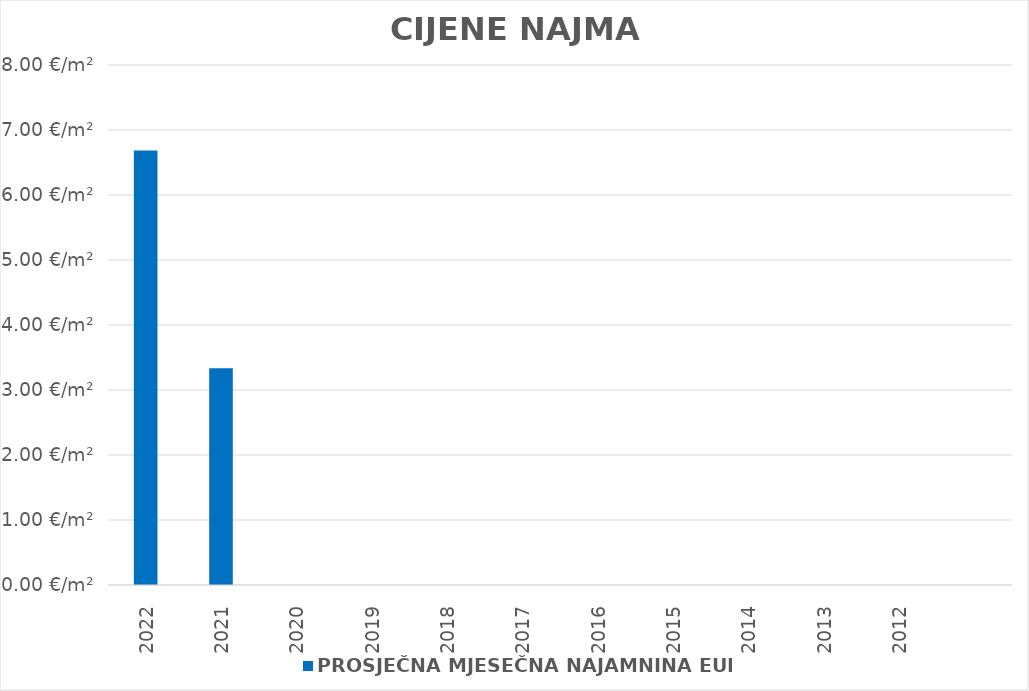
| Category | PROSJEČNA MJESEČNA NAJAMNINA EUR/m² |
|---|---|
| 2022 | 1900-01-06 16:27:31 |
| 2021 | 1900-01-03 08:03:34 |
| 2020 | 0 |
| 2019 | 0 |
| 2018 | 0 |
| 2017 | 0 |
| 2016 | 0 |
| 2015 | 0 |
| 2014 | 0 |
| 2013 | 0 |
| 2012 | 0 |